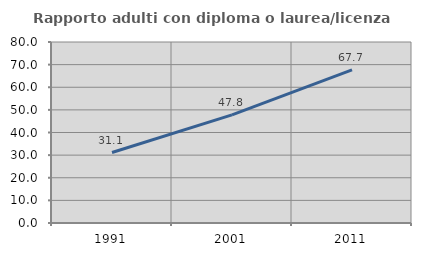
| Category | Rapporto adulti con diploma o laurea/licenza media  |
|---|---|
| 1991.0 | 31.148 |
| 2001.0 | 47.778 |
| 2011.0 | 67.708 |